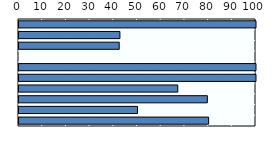
| Category | Payment rate (%) |
|---|---|
| Viet Nam | 100 |
| New Zealand | 42.577 |
| Australia | 42.289 |
| OECD average (c) | 0 |
| Singapore | 100 |
| China | 100 |
| Japan | 67 |
| Korea | 79.474 |
| Thailand | 50 |
| Hong Kong (China) | 80 |